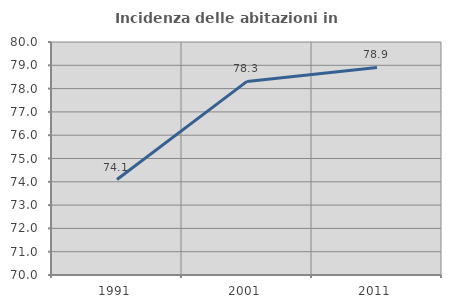
| Category | Incidenza delle abitazioni in proprietà  |
|---|---|
| 1991.0 | 74.098 |
| 2001.0 | 78.308 |
| 2011.0 | 78.91 |